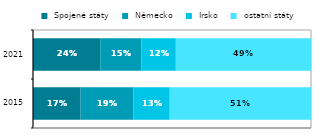
| Category |  Spojené státy |  Německo |  Irsko |  ostatní státy |
|---|---|---|---|---|
|  2015 | 0.171 | 0.189 | 0.131 | 0.508 |
| 2021 | 0.242 | 0.147 | 0.124 | 0.486 |